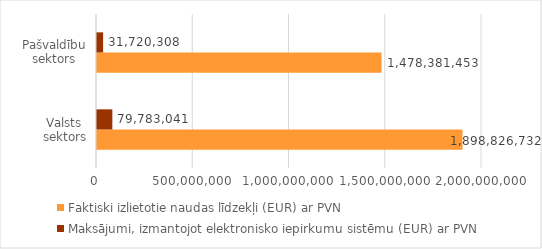
| Category | Faktiski izlietotie naudas līdzekļi (EUR) ar PVN | Maksājumi, izmantojot elektronisko iepirkumu sistēmu (EUR) ar PVN |
|---|---|---|
| Valsts sektors | 1898826732 | 79783041 |
| Pašvaldību sektors | 1478381453 | 31720308 |